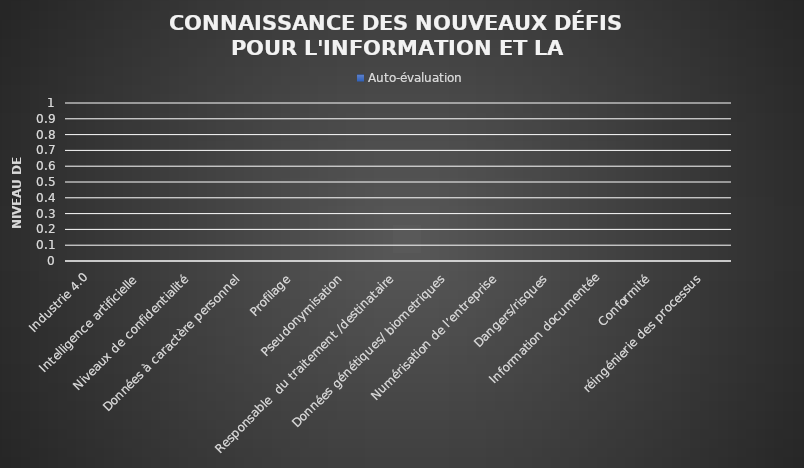
| Category | Αuto-évaluation |
|---|---|
| Industrie 4.0 | 0 |
| Intelligence artificielle | 0 |
| Niveaux de confidentialité | 0 |
| Données à caractère personnel | 0 |
| Profilage | 0 |
| Pseudonymisation | 0 |
| Responsable  du traitement /destinataire | 0 |
| Données génétiques/ biometriques | 0 |
| Numérisation de l’entreprise | 0 |
| Dangers/risques | 0 |
| Information documentée | 0 |
| Conformité | 0 |
| réingénierie des processus | 0 |